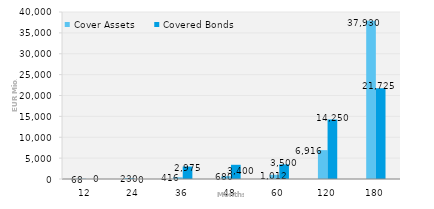
| Category | Cover Assets | Covered Bonds |
|---|---|---|
| 12.0 | 67.787 | 0 |
| 24.0 | 229.712 | 0 |
| 36.0 | 415.636 | 2975 |
| 48.0 | 679.595 | 3400 |
| 60.0 | 1012.362 | 3500 |
| 120.0 | 6915.85 | 14250 |
| 180.0 | 37929.898 | 21725 |